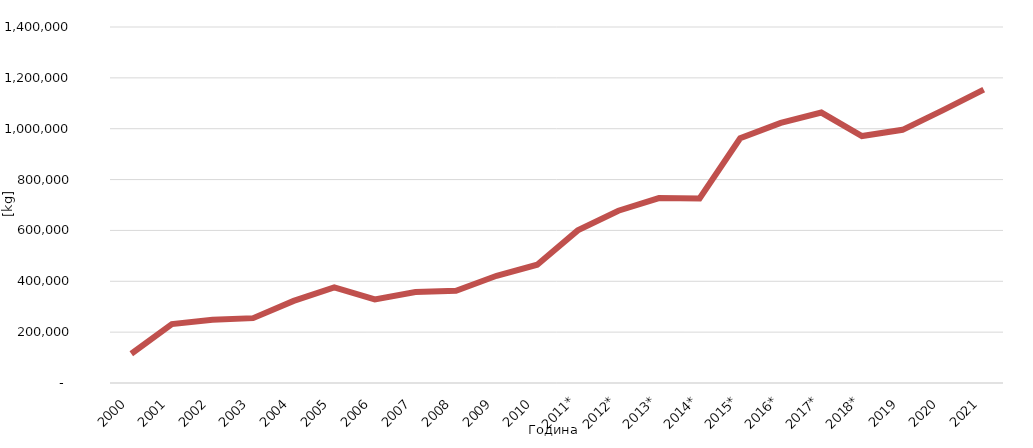
| Category | Количина во кг |
|---|---|
| 2000 | 114900 |
| 2001 | 231900 |
| 2002 | 248600 |
| 2003 | 255063 |
| 2004 | 322941 |
| 2005 | 375903 |
| 2006 | 328770 |
| 2007 | 357477 |
| 2008 | 362852 |
| 2009 | 421756 |
| 2010 | 465093 |
| 2011* | 600105 |
| 2012* | 677454 |
| 2013* | 727325 |
| 2014* | 725678 |
| 2015* | 962396 |
| 2016* | 1023133 |
| 2017* | 1063626 |
| 2018* | 971137 |
| 2019 | 995601 |
| 2020 | 1073012 |
| 2021 | 1153770 |